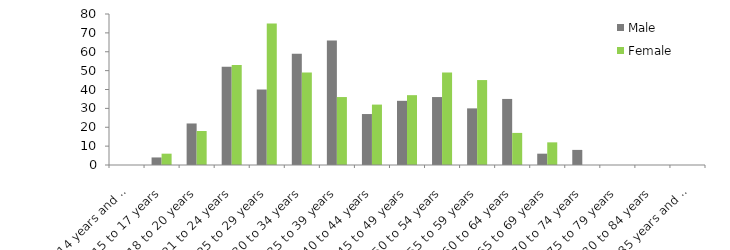
| Category | Male | Female |
|---|---|---|
| 14 years and under | 0 | 0 |
| 15 to 17 years | 4 | 6 |
| 18 to 20 years | 22 | 18 |
| 21 to 24 years | 52 | 53 |
| 25 to 29 years | 40 | 75 |
| 30 to 34 years | 59 | 49 |
| 35 to 39 years | 66 | 36 |
| 40 to 44 years | 27 | 32 |
| 45 to 49 years | 34 | 37 |
| 50 to 54 years | 36 | 49 |
| 55 to 59 years | 30 | 45 |
| 60 to 64 years | 35 | 17 |
| 65 to 69 years | 6 | 12 |
| 70 to 74 years | 8 | 0 |
| 75 to 79 years | 0 | 0 |
| 80 to 84 years | 0 | 0 |
| 85 years and over | 0 | 0 |